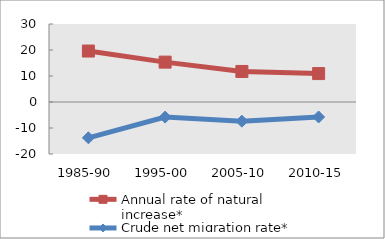
| Category | Annual rate of natural increase* | Crude net migration rate* |
|---|---|---|
| 1985-90 | 19.602 | -13.77 |
| 1995-00 | 15.334 | -5.805 |
| 2005-10 | 11.751 | -7.375 |
| 2010-15 | 10.93 | -5.761 |